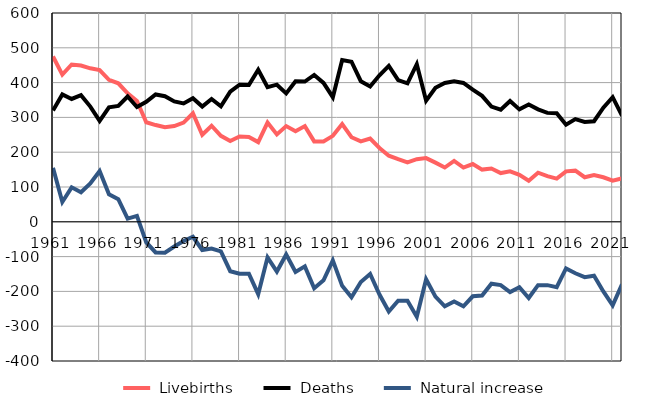
| Category |  Livebirths |  Deaths |  Natural increase |
|---|---|---|---|
| 1961.0 | 475 | 320 | 155 |
| 1962.0 | 423 | 366 | 57 |
| 1963.0 | 452 | 353 | 99 |
| 1964.0 | 449 | 364 | 85 |
| 1965.0 | 441 | 331 | 110 |
| 1966.0 | 436 | 290 | 146 |
| 1967.0 | 408 | 329 | 79 |
| 1968.0 | 398 | 333 | 65 |
| 1969.0 | 369 | 360 | 9 |
| 1970.0 | 347 | 330 | 17 |
| 1971.0 | 286 | 345 | -59 |
| 1972.0 | 278 | 366 | -88 |
| 1973.0 | 272 | 361 | -89 |
| 1974.0 | 275 | 346 | -71 |
| 1975.0 | 285 | 340 | -55 |
| 1976.0 | 312 | 355 | -43 |
| 1977.0 | 250 | 331 | -81 |
| 1978.0 | 276 | 353 | -77 |
| 1979.0 | 247 | 332 | -85 |
| 1980.0 | 232 | 374 | -142 |
| 1981.0 | 245 | 394 | -149 |
| 1982.0 | 244 | 393 | -149 |
| 1983.0 | 229 | 437 | -208 |
| 1984.0 | 285 | 387 | -102 |
| 1985.0 | 251 | 394 | -143 |
| 1986.0 | 275 | 369 | -94 |
| 1987.0 | 260 | 404 | -144 |
| 1988.0 | 275 | 403 | -128 |
| 1989.0 | 231 | 422 | -191 |
| 1990.0 | 231 | 399 | -168 |
| 1991.0 | 247 | 358 | -111 |
| 1992.0 | 281 | 465 | -184 |
| 1993.0 | 243 | 460 | -217 |
| 1994.0 | 231 | 404 | -173 |
| 1995.0 | 239 | 389 | -150 |
| 1996.0 | 212 | 421 | -209 |
| 1997.0 | 190 | 448 | -258 |
| 1998.0 | 180 | 407 | -227 |
| 1999.0 | 171 | 398 | -227 |
| 2000.0 | 180 | 453 | -273 |
| 2001.0 | 183 | 348 | -165 |
| 2002.0 | 170 | 385 | -215 |
| 2003.0 | 156 | 399 | -243 |
| 2004.0 | 175 | 404 | -229 |
| 2005.0 | 156 | 399 | -243 |
| 2006.0 | 166 | 380 | -214 |
| 2007.0 | 150 | 362 | -212 |
| 2008.0 | 153 | 331 | -178 |
| 2009.0 | 140 | 322 | -182 |
| 2010.0 | 145 | 347 | -202 |
| 2011.0 | 135 | 323 | -188 |
| 2012.0 | 118 | 337 | -219 |
| 2013.0 | 141 | 323 | -182 |
| 2014.0 | 131 | 313 | -182 |
| 2015.0 | 124 | 312 | -188 |
| 2016.0 | 145 | 279 | -134 |
| 2017.0 | 147 | 295 | -148 |
| 2018.0 | 128 | 287 | -159 |
| 2019.0 | 134 | 289 | -155 |
| 2020.0 | 128 | 328 | -200 |
| 2021.0 | 118 | 358 | -240 |
| 2022.0 | 125 | 305 | -180 |